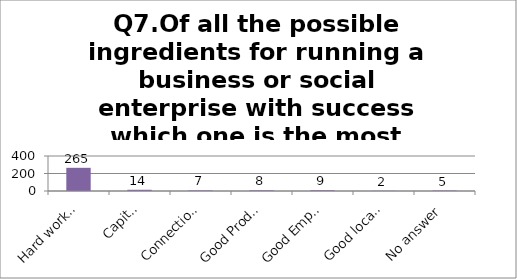
| Category | Q7.Of all the possible ingredients for running a business or social enterprise with success which one is the most important |
|---|---|
| Hard work and determination | 265 |
| Capital | 14 |
| Connections | 7 |
| Good Product or Service | 8 |
| Good Employees | 9 |
| Good location for the business | 2 |
| No answer | 5 |